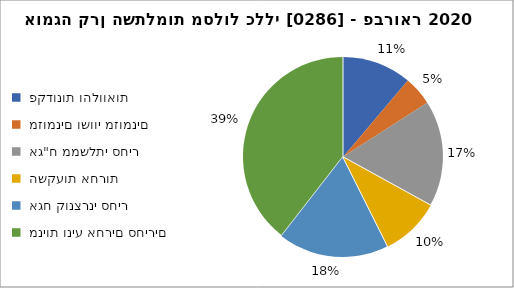
| Category | אומגה קרן השתלמות מסלול כללי [0286] - פברואר 2020 |
|---|---|
|  פקדונות והלוואות  | 270225 |
|  מזומנים ושווי מזומנים   | 113917 |
|  אג"ח ממשלתי סחיר  | 413201 |
|  השקעות אחרות  | 231681 |
|  אגח קונצרני סחיר  | 432246 |
|  מניות וניע אחרים סחירים   | 952830 |